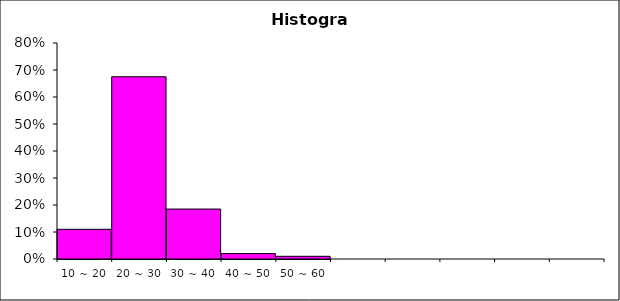
| Category | Freq |
|---|---|
| 10 ~ 20 | 0.11 |
| 20 ~ 30 | 0.675 |
| 30 ~ 40 | 0.185 |
| 40 ~ 50 | 0.02 |
| 50 ~ 60 | 0.01 |